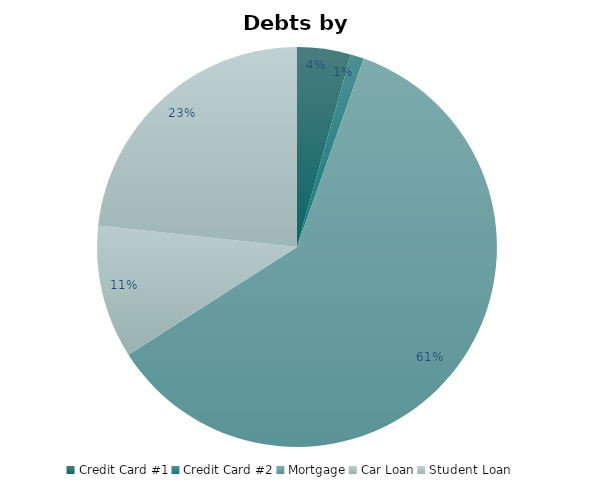
| Category | Series 0 |
|---|---|
| Credit Card #1 | 3225.34 |
| Credit Card #2 | 800 |
| Mortgage | 45000 |
| Car Loan | 8000 |
| Student Loan | 17312 |